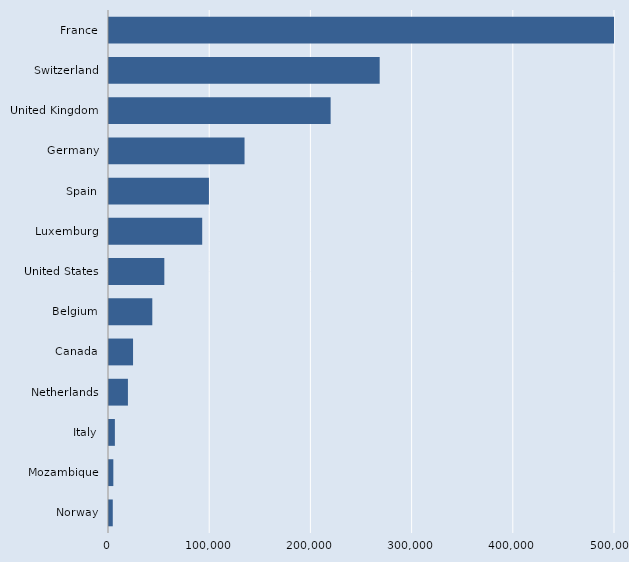
| Category | Series 0 |
|---|---|
| Norway | 3731 |
| Mozambique | 4279 |
| Italy | 5815 |
| Netherlands | 18704 |
| Canada | 23765 |
| Belgium | 42794 |
| United States | 54669 |
| Luxemburg | 92100 |
| Spain | 98751 |
| Germany | 133929 |
| United Kingdom | 219000 |
| Switzerland | 267474 |
| France | 519500 |